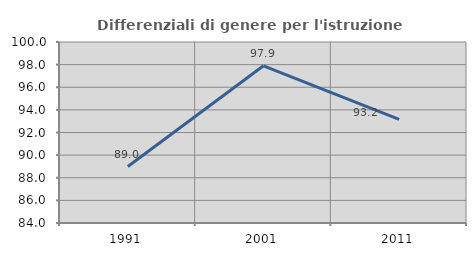
| Category | Differenziali di genere per l'istruzione superiore |
|---|---|
| 1991.0 | 88.99 |
| 2001.0 | 97.898 |
| 2011.0 | 93.155 |